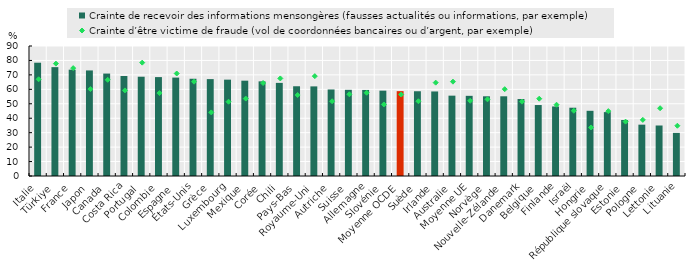
| Category | Crainte de recevoir des informations mensongères (fausses actualités ou informations, par exemple) |
|---|---|
| Italie | 78.43 |
| Türkiye | 75.366 |
| France | 73.613 |
| Japon | 73.088 |
| Canada | 70.92 |
| Costa Rica | 69.252 |
| Portugal | 68.733 |
| Colombie | 68.471 |
| Espagne | 68.138 |
| États­Unis | 67.323 |
| Grèce | 67.081 |
| Luxembourg | 66.705 |
| Mexique | 65.991 |
| Corée | 65.524 |
| Chili | 64.46 |
| Pays­Bas | 62.129 |
| Royaume­Uni | 62.042 |
| Autriche | 59.906 |
| Suisse | 59.662 |
| Allemagne | 59.57 |
| Slovénie | 59.087 |
| Moyenne OCDE | 58.75 |
| Suède | 58.68 |
| Irlande | 58.53 |
| Australie | 55.619 |
| Moyenne UE | 55.5 |
| Norvège | 55.185 |
| Nouvelle­Zélande | 55.182 |
| Danemark | 53.286 |
| Belgique | 49.134 |
| Finlande | 48.135 |
| Israël | 47.274 |
| Hongrie | 45.133 |
| République slovaque | 44.234 |
| Estonie | 38.766 |
| Pologne | 35.546 |
| Lettonie | 34.965 |
| Lituanie | 29.853 |